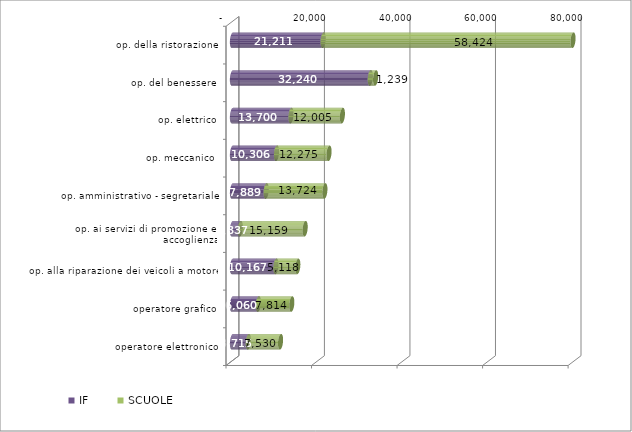
| Category | IF | SCUOLE |
|---|---|---|
| op. della ristorazione | 21211 | 58424 |
| op. del benessere | 32240 | 1239 |
| op. elettrico | 13700 | 12005 |
| op. meccanico | 10306 | 12275 |
| op. amministrativo - segretariale | 7889 | 13724 |
| op. ai servizi di promozione ed accoglienza | 1837 | 15159 |
| op. alla riparazione dei veicoli a motore | 10167 | 5118 |
| operatore grafico | 6060 | 7814 |
| operatore elettronico | 3715 | 7530 |